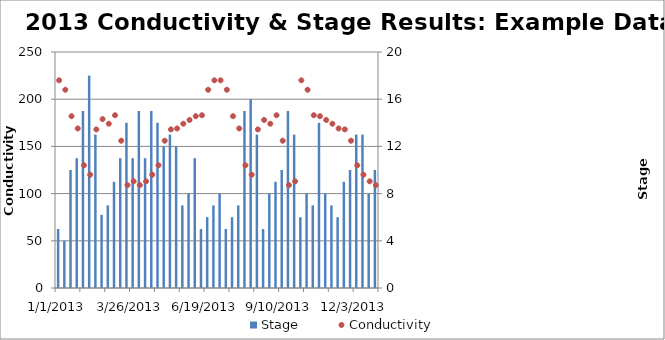
| Category | Stage |
|---|---|
|  | 5 |
|  | 4 |
|  | 10 |
|  | 11 |
|  | 15 |
|  | 18 |
|  | 13 |
|  | 6.2 |
|  | 7 |
|  | 9 |
|  | 11 |
|  | 14 |
|  | 11 |
|  | 15 |
|  | 11 |
|  | 15 |
|  | 14 |
|  | 12 |
|  | 13 |
|  | 12 |
|  | 7 |
|  | 8 |
|  | 11 |
|  | 5 |
|  | 6 |
|  | 7 |
|  | 8 |
|  | 5 |
|  | 6 |
|  | 7 |
|  | 15 |
|  | 16 |
|  | 13 |
|  | 5 |
|  | 8 |
|  | 9 |
|  | 10 |
|  | 15 |
|  | 13 |
|  | 6 |
|  | 8 |
|  | 7 |
|  | 14 |
|  | 8 |
|  | 7 |
|  | 6 |
|  | 9 |
|  | 10 |
|  | 13 |
|  | 13 |
|  | 8 |
|  | 10 |